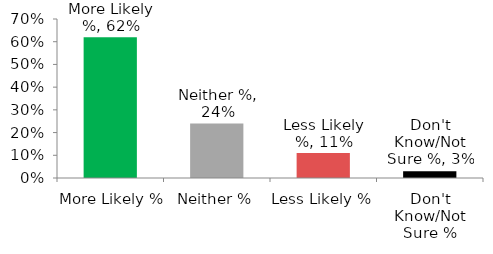
| Category | More Likely % |
|---|---|
| More Likely % | 0.62 |
| Neither % | 0.24 |
| Less Likely % | 0.11 |
| Don't Know/Not Sure % | 0.03 |